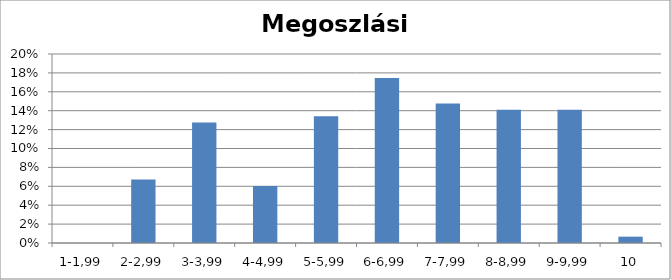
| Category | Series 0 |
|---|---|
| 1-1,99 | 0 |
| 2-2,99 | 0.067 |
| 3-3,99 | 0.128 |
| 4-4,99 | 0.06 |
| 5-5,99 | 0.134 |
| 6-6,99 | 0.174 |
| 7-7,99 | 0.148 |
| 8-8,99 | 0.141 |
| 9-9,99 | 0.141 |
| 10 | 0.007 |